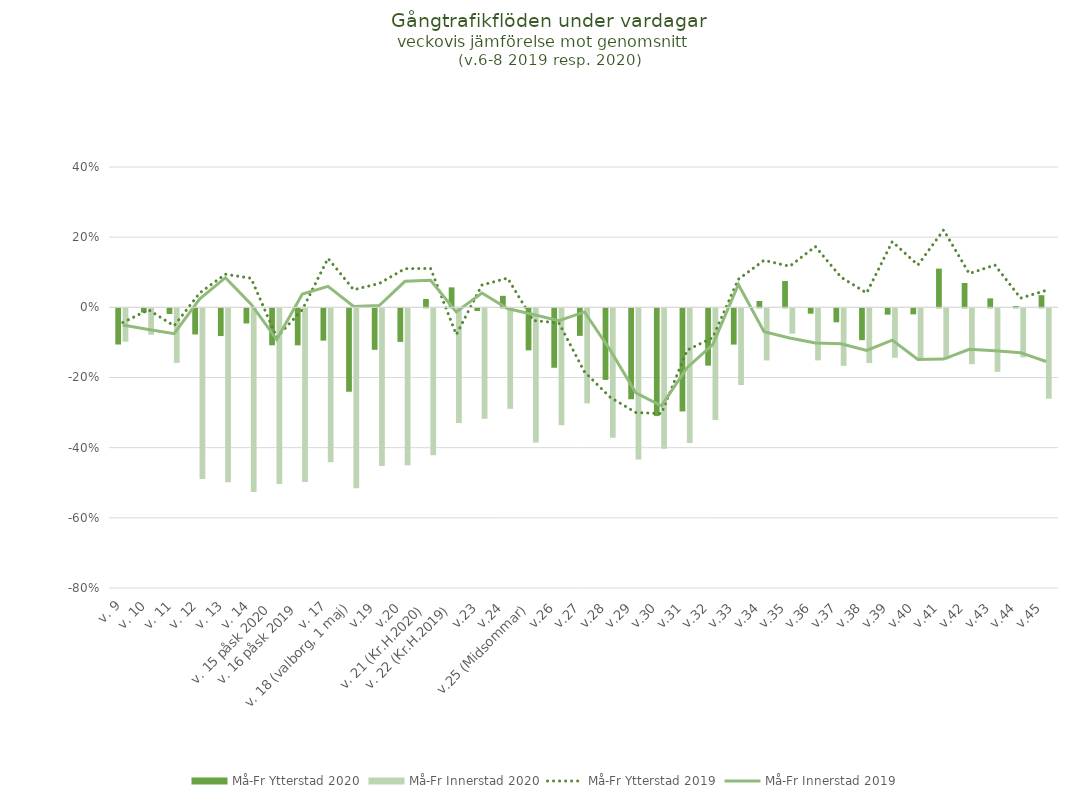
| Category | Må-Fr |
|---|---|
| v. 9 | -0.095 |
| v. 10 | -0.075 |
| v. 11 | -0.156 |
| v. 12 | -0.486 |
| v. 13 | -0.496 |
| v. 14 | -0.524 |
| v. 15 påsk 2020 | -0.501 |
| v. 16 påsk 2019 | -0.495 |
| v. 17 | -0.439 |
| v. 18 (valborg, 1 maj) | -0.513 |
| v.19 | -0.449 |
| v.20 | -0.447 |
| v. 21 (Kr.H.2020) | -0.419 |
| v. 22 (Kr.H.2019) | -0.327 |
| v.23 | -0.315 |
| v.24 | -0.286 |
| v.25 (Midsommar) | -0.382 |
| v.26 | -0.333 |
| v.27 | -0.271 |
| v.28 | -0.369 |
| v.29 | -0.431 |
| v.30 | -0.4 |
| v.31 | -0.384 |
| v.32 | -0.318 |
| v.33 | -0.219 |
| v.34 | -0.148 |
| v.35 | -0.072 |
| v.36 | -0.148 |
| v.37 | -0.164 |
| v.38 | -0.156 |
| v.39 | -0.141 |
| v.40 | -0.142 |
| v.41 | -0.145 |
| v.42 | -0.159 |
| v.43 | -0.181 |
| v.44 | -0.14 |
| v.45 | -0.258 |